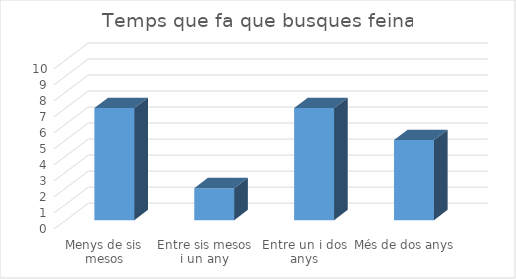
| Category | Series 0 |
|---|---|
| Menys de sis mesos | 7 |
| Entre sis mesos i un any | 2 |
| Entre un i dos anys | 7 |
| Més de dos anys | 5 |